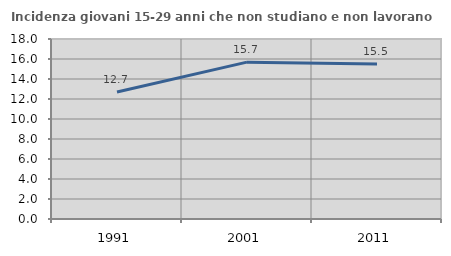
| Category | Incidenza giovani 15-29 anni che non studiano e non lavorano  |
|---|---|
| 1991.0 | 12.703 |
| 2001.0 | 15.686 |
| 2011.0 | 15.493 |